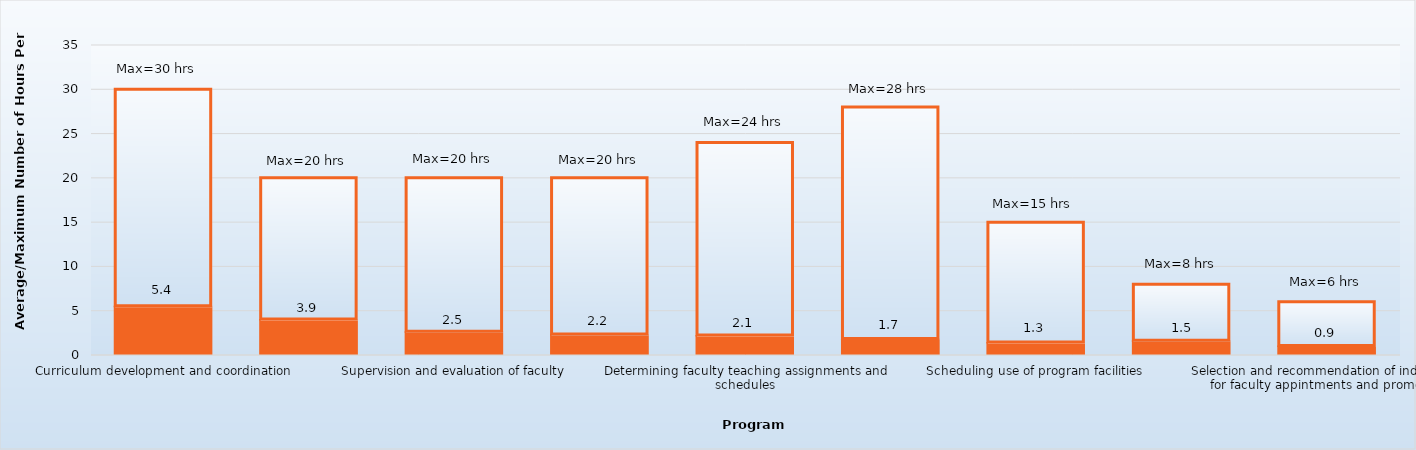
| Category | Average hours per week | Maximum |
|---|---|---|
| Curriculum development and coordination | 5.4 | 24.6 |
| Development and responsibilities to maintain CODA accreditation compliance and documentation | 3.9 | 16.1 |
| Supervision and evaluation of faculty | 2.5 | 17.5 |
| Fiscal administration | 2.2 | 17.8 |
| Determining faculty teaching assignments and schedules | 2.1 | 21.9 |
| Budget preparation | 1.7 | 26.3 |
| Scheduling use of program facilities | 1.3 | 13.7 |
| Determining admissions criteria and procedures | 1.5 | 6.5 |
| Selection and recommendation of individuals for faculty appintments and promotion | 0.9 | 5.1 |